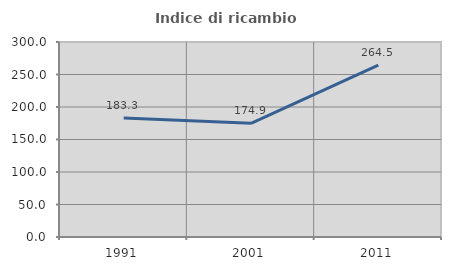
| Category | Indice di ricambio occupazionale  |
|---|---|
| 1991.0 | 183.256 |
| 2001.0 | 174.897 |
| 2011.0 | 264.532 |